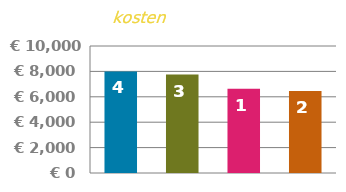
| Category | VOORAF |
|---|---|
| 0 | 8000 |
| 1 | 7750 |
| 2 | 6625 |
| 3 | 6450 |